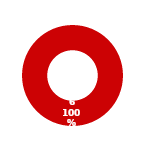
| Category | IAM |
|---|---|
| MIL 2 Complete | 0 |
| MIL 2 Not Complete | 6 |